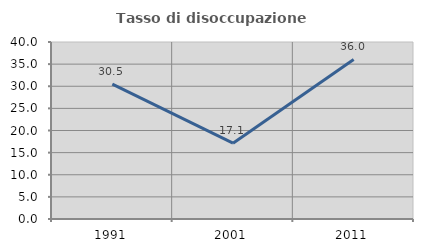
| Category | Tasso di disoccupazione giovanile  |
|---|---|
| 1991.0 | 30.462 |
| 2001.0 | 17.131 |
| 2011.0 | 36.047 |